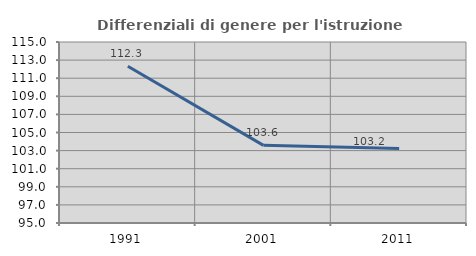
| Category | Differenziali di genere per l'istruzione superiore |
|---|---|
| 1991.0 | 112.322 |
| 2001.0 | 103.582 |
| 2011.0 | 103.233 |